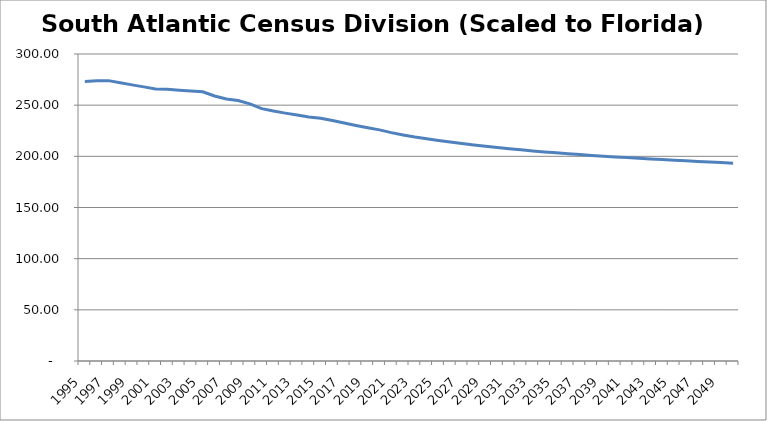
| Category | NGHeating |
|---|---|
| 1995.0 | 273.072 |
| 1996.0 | 273.938 |
| 1997.0 | 273.974 |
| 1998.0 | 271.859 |
| 1999.0 | 269.85 |
| 2000.0 | 267.871 |
| 2001.0 | 265.897 |
| 2002.0 | 265.484 |
| 2003.0 | 264.687 |
| 2004.0 | 263.896 |
| 2005.0 | 263.142 |
| 2006.0 | 258.983 |
| 2007.0 | 256.117 |
| 2008.0 | 254.547 |
| 2009.0 | 251.281 |
| 2010.0 | 246.583 |
| 2011.0 | 244.231 |
| 2012.0 | 242.235 |
| 2013.0 | 240.435 |
| 2014.0 | 238.433 |
| 2015.0 | 237.26 |
| 2016.0 | 234.929 |
| 2017.0 | 232.605 |
| 2018.0 | 230.187 |
| 2019.0 | 228.018 |
| 2020.0 | 225.831 |
| 2021.0 | 223.177 |
| 2022.0 | 220.918 |
| 2023.0 | 218.811 |
| 2024.0 | 217.108 |
| 2025.0 | 215.541 |
| 2026.0 | 214.001 |
| 2027.0 | 212.551 |
| 2028.0 | 211.16 |
| 2029.0 | 209.835 |
| 2030.0 | 208.623 |
| 2031.0 | 207.439 |
| 2032.0 | 206.359 |
| 2033.0 | 205.311 |
| 2034.0 | 204.328 |
| 2035.0 | 203.414 |
| 2036.0 | 202.559 |
| 2037.0 | 201.709 |
| 2038.0 | 200.908 |
| 2039.0 | 200.148 |
| 2040.0 | 199.437 |
| 2041.0 | 198.758 |
| 2042.0 | 198.119 |
| 2043.0 | 197.475 |
| 2044.0 | 196.855 |
| 2045.0 | 196.255 |
| 2046.0 | 195.651 |
| 2047.0 | 195.051 |
| 2048.0 | 194.468 |
| 2049.0 | 193.886 |
| 2050.0 | 193.32 |